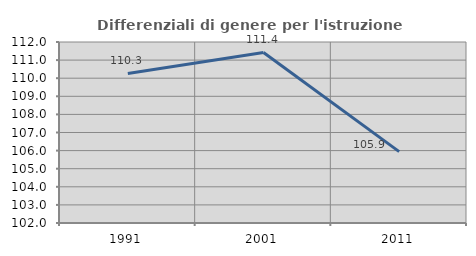
| Category | Differenziali di genere per l'istruzione superiore |
|---|---|
| 1991.0 | 110.26 |
| 2001.0 | 111.421 |
| 2011.0 | 105.944 |